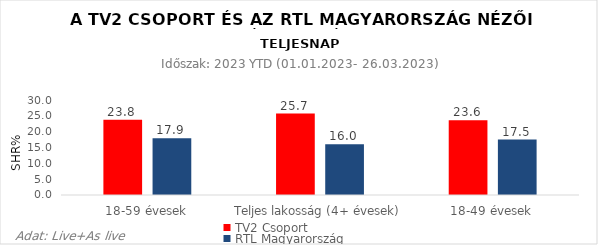
| Category | TV2 Csoport | RTL Magyarország |
|---|---|---|
| 18-59 évesek | 23.8 | 17.9 |
| Teljes lakosság (4+ évesek) | 25.7 | 16 |
| 18-49 évesek | 23.6 | 17.5 |